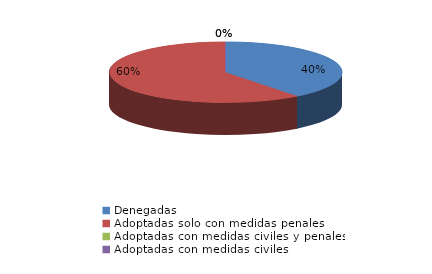
| Category | Series 0 |
|---|---|
| Denegadas | 32 |
| Adoptadas solo con medidas penales | 49 |
| Adoptadas con medidas civiles y penales | 0 |
| Adoptadas con medidas civiles | 0 |